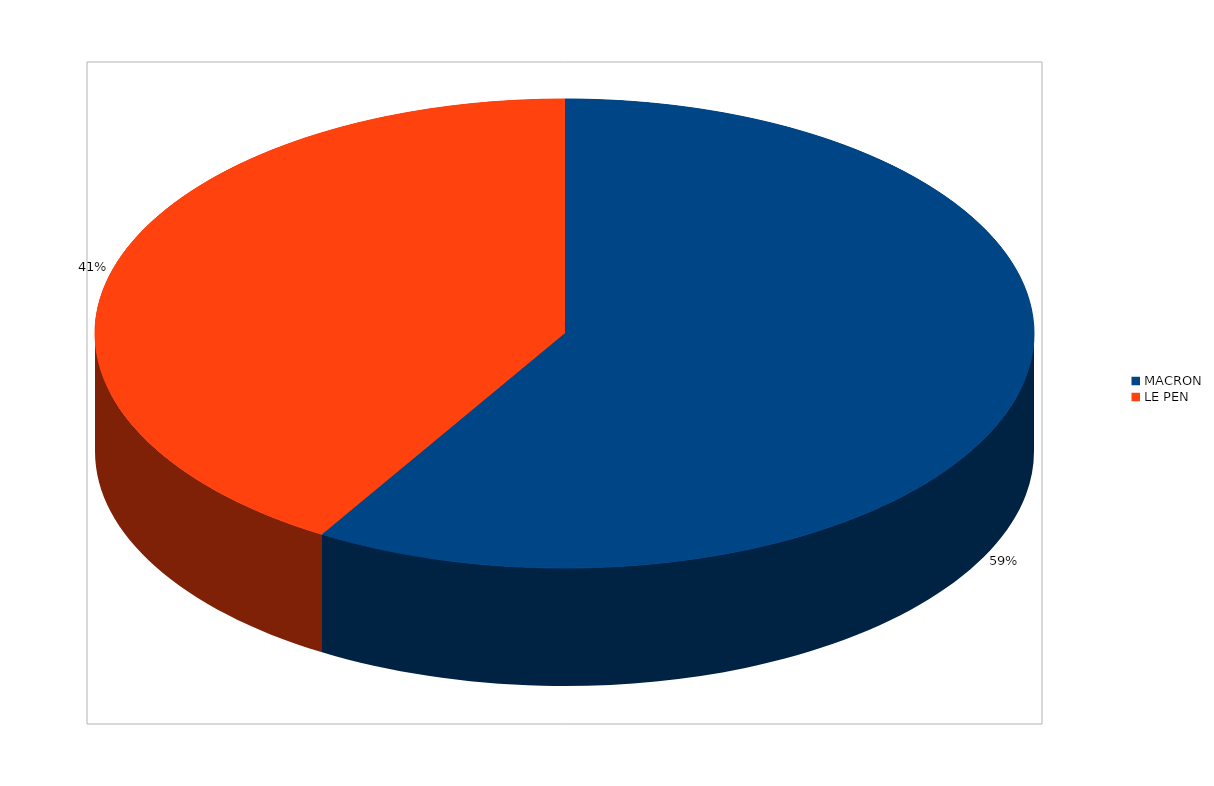
| Category | Series 0 |
|---|---|
| MACRON | 16637 |
| LE PEN | 11737 |